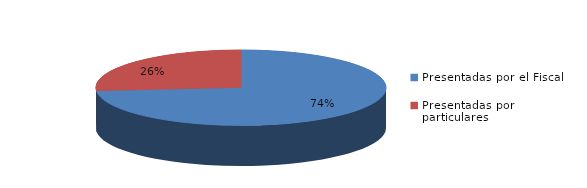
| Category | Series 0 |
|---|---|
| Presentadas por el Fiscal | 3366 |
| Presentadas por particulares | 1210 |